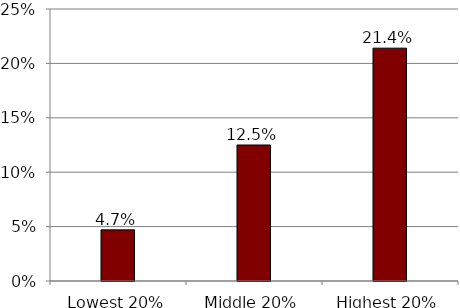
| Category | Series 0 |
|---|---|
| Lowest 20% | 0.047 |
| Middle 20% | 0.125 |
| Highest 20% | 0.214 |